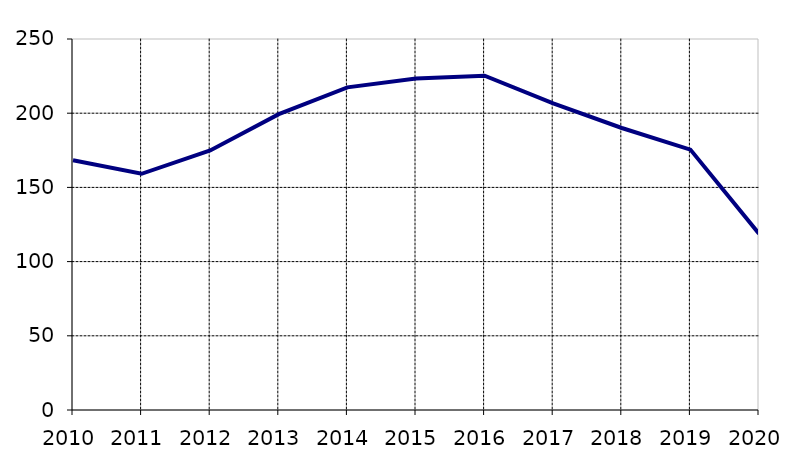
| Category | Series 0 |
|---|---|
| 2010 | 168.251 |
| 2011 | 159.178 |
| 2012 | 174.859 |
| 2013 | 199.343 |
| 2014 | 217.4 |
| 2015 | 223.45 |
| 2016 | 225.244 |
| 2017 | 206.618 |
| 2018 | 190.035 |
| 2019 | 175.465 |
| 2020 | 118.841 |